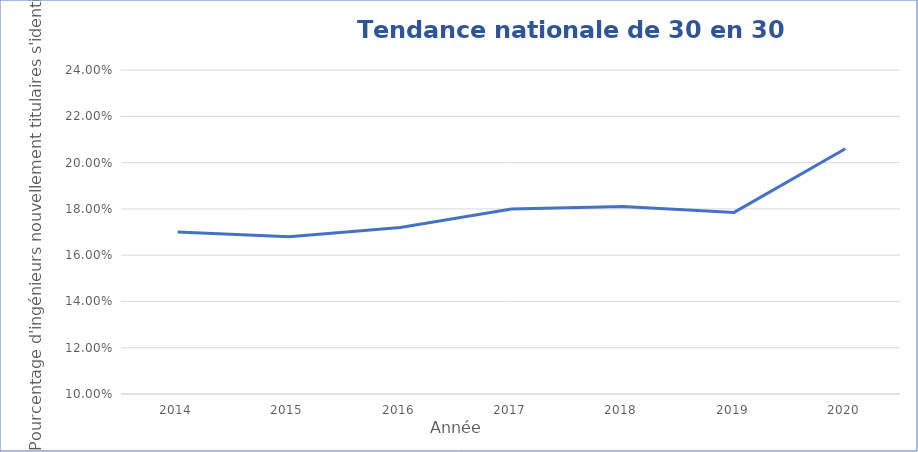
| Category |   Pourcentage de 30 en 30 à l'échelle nationale   |
|---|---|
| 2014.0 | 0.17 |
| 2015.0 | 0.168 |
| 2016.0 | 0.172 |
| 2017.0 | 0.18 |
| 2018.0 | 0.181 |
| 2019.0 | 0.178 |
| 2020.0 | 0.206 |